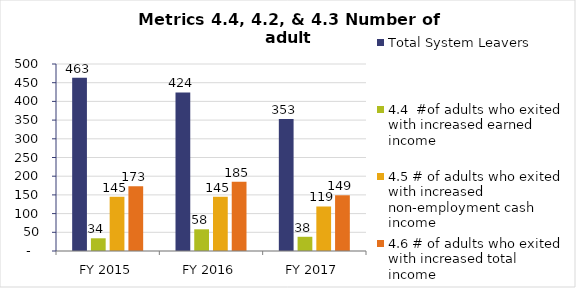
| Category | Total System Leavers | 4.4  #of adults who exited with increased earned income | 4.5 # of adults who exited with increased non-employment cash income | 4.6 # of adults who exited with increased total income |
|---|---|---|---|---|
| FY 2015 | 463 | 34 | 145 | 173 |
| FY 2016 | 424 | 58 | 145 | 185 |
| FY 2017 | 353 | 38 | 119 | 149 |